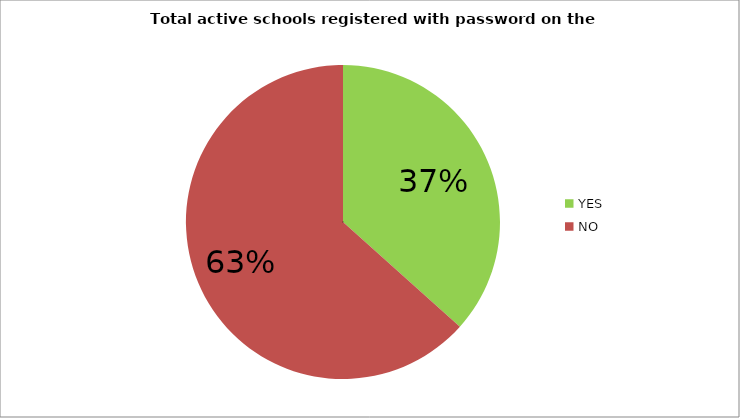
| Category | Totals schools registered with password on the school portal |
|---|---|
| YES | 0.37 |
| NO | 0.64 |